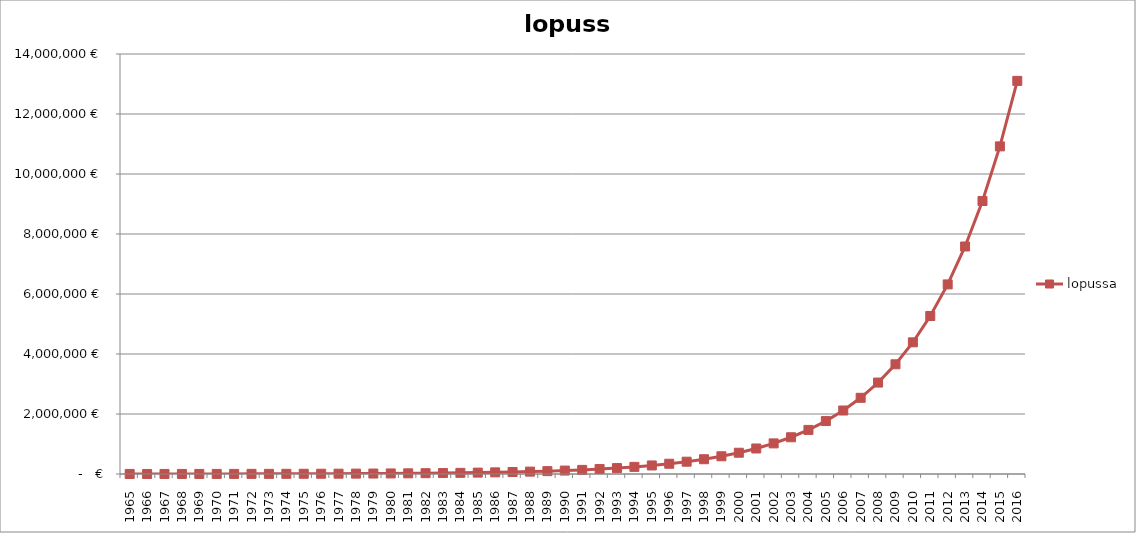
| Category | lopussa |
|---|---|
| 1965.0 | 1200 |
| 1966.0 | 1440 |
| 1967.0 | 1728 |
| 1968.0 | 2073.6 |
| 1969.0 | 2488.32 |
| 1970.0 | 2985.984 |
| 1971.0 | 3583.181 |
| 1972.0 | 4299.817 |
| 1973.0 | 5159.78 |
| 1974.0 | 6191.736 |
| 1975.0 | 7430.084 |
| 1976.0 | 8916.1 |
| 1977.0 | 10699.321 |
| 1978.0 | 12839.185 |
| 1979.0 | 15407.022 |
| 1980.0 | 18488.426 |
| 1981.0 | 22186.111 |
| 1982.0 | 26623.333 |
| 1983.0 | 31948 |
| 1984.0 | 38337.6 |
| 1985.0 | 46005.12 |
| 1986.0 | 55206.144 |
| 1987.0 | 66247.373 |
| 1988.0 | 79496.847 |
| 1989.0 | 95396.217 |
| 1990.0 | 114475.46 |
| 1991.0 | 137370.552 |
| 1992.0 | 164844.662 |
| 1993.0 | 197813.595 |
| 1994.0 | 237376.314 |
| 1995.0 | 284851.577 |
| 1996.0 | 341821.892 |
| 1997.0 | 410186.27 |
| 1998.0 | 492223.524 |
| 1999.0 | 590668.229 |
| 2000.0 | 708801.875 |
| 2001.0 | 850562.25 |
| 2002.0 | 1020674.7 |
| 2003.0 | 1224809.64 |
| 2004.0 | 1469771.568 |
| 2005.0 | 1763725.882 |
| 2006.0 | 2116471.058 |
| 2007.0 | 2539765.269 |
| 2008.0 | 3047718.323 |
| 2009.0 | 3657261.988 |
| 2010.0 | 4388714.386 |
| 2011.0 | 5266457.263 |
| 2012.0 | 6319748.715 |
| 2013.0 | 7583698.458 |
| 2014.0 | 9100438.15 |
| 2015.0 | 10920525.78 |
| 2016.0 | 13104630.936 |